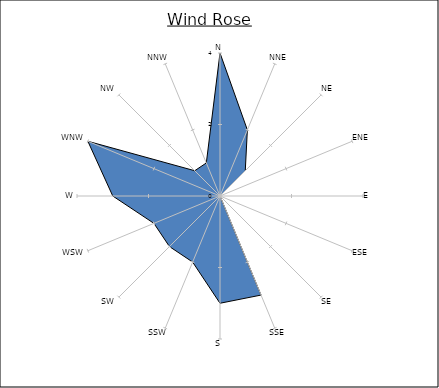
| Category | Series 0 |
|---|---|
| N | 4 |
| NNE | 2 |
| NE | 1 |
| ENE | 0 |
| E | 0 |
| ESE | 0 |
| SE | 0 |
| SSE | 3 |
| S | 3 |
| SSW | 2 |
| SW | 2 |
| WSW | 2 |
| W | 3 |
| WNW | 4 |
| NW | 1 |
| NNW | 1 |